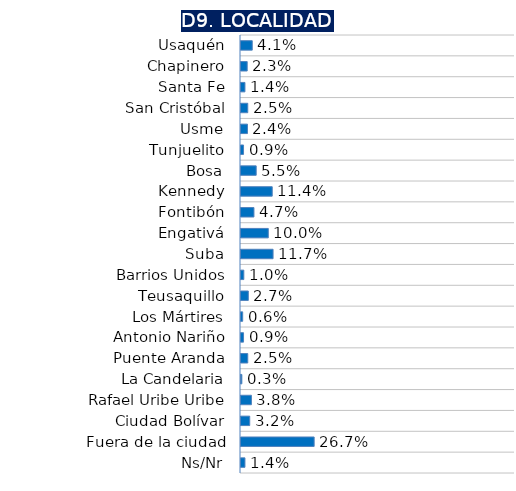
| Category | Series 0 |
|---|---|
| Usaquén | 0.041 |
| Chapinero | 0.023 |
| Santa Fe | 0.014 |
| San Cristóbal | 0.025 |
| Usme | 0.024 |
| Tunjuelito | 0.009 |
| Bosa | 0.055 |
| Kennedy | 0.114 |
| Fontibón | 0.047 |
| Engativá | 0.1 |
| Suba | 0.117 |
| Barrios Unidos | 0.01 |
| Teusaquillo | 0.027 |
| Los Mártires | 0.006 |
| Antonio Nariño | 0.009 |
| Puente Aranda | 0.025 |
| La Candelaria | 0.003 |
| Rafael Uribe Uribe | 0.038 |
| Ciudad Bolívar | 0.032 |
| Fuera de la ciudad | 0.267 |
| Ns/Nr | 0.014 |